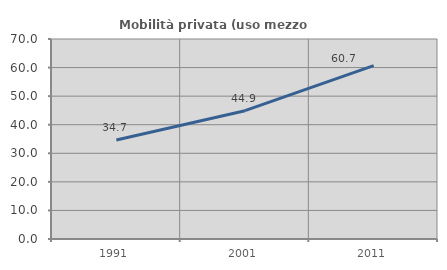
| Category | Mobilità privata (uso mezzo privato) |
|---|---|
| 1991.0 | 34.674 |
| 2001.0 | 44.906 |
| 2011.0 | 60.701 |